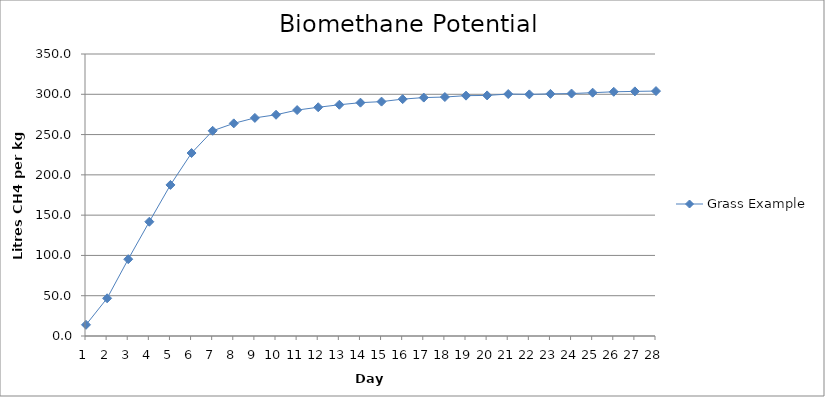
| Category | Grass Example |
|---|---|
| 1.0 | 13.9 |
| 2.0 | 46.8 |
| 3.0 | 95.3 |
| 4.0 | 141.8 |
| 5.0 | 187.5 |
| 6.0 | 227.1 |
| 7.0 | 254.7 |
| 8.0 | 263.9 |
| 9.0 | 270.7 |
| 10.0 | 274.6 |
| 11.0 | 280.4 |
| 12.0 | 283.9 |
| 13.0 | 287 |
| 14.0 | 289.6 |
| 15.0 | 290.9 |
| 16.0 | 294 |
| 17.0 | 295.9 |
| 18.0 | 296.6 |
| 19.0 | 298.3 |
| 20.0 | 298.6 |
| 21.0 | 300.3 |
| 22.0 | 299.9 |
| 23.0 | 300.5 |
| 24.0 | 300.9 |
| 25.0 | 302 |
| 26.0 | 303.1 |
| 27.0 | 303.6 |
| 28.0 | 304 |